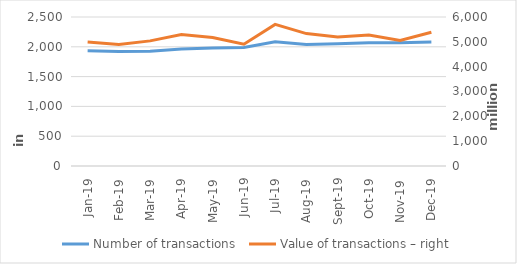
| Category | Number of transactions  |
|---|---|
| sij.19 | 1932393 |
| Feb-19 | 1921638 |
| ožu.19 | 1923804 |
| Apr-19 | 1962470 |
| svi.19 | 1977784 |
| lip.19 | 1986816 |
| srp.19 | 2085605 |
| kol.19 | 2040569 |
| ruj.19 | 2050439 |
| lis.19 | 2068897 |
| stu.19 | 2066452 |
| Dec-19 | 2079103 |